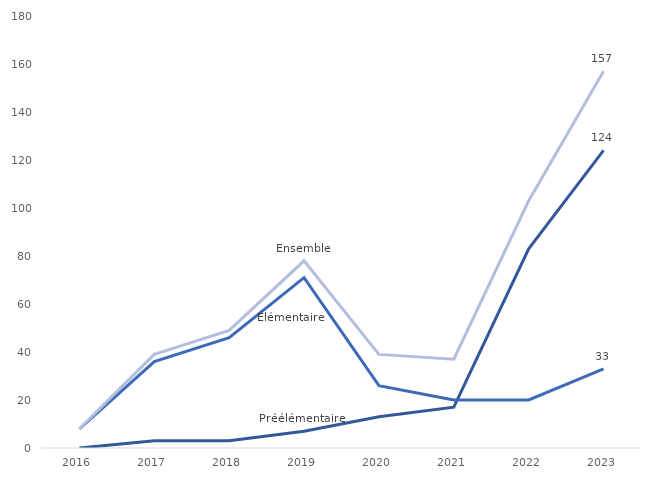
| Category | Préélémentaire  | Élémentaire  | Ensemble |
|---|---|---|---|
| 2016.0 | 0 | 8 | 8 |
| 2017.0 | 3 | 36 | 39 |
| 2018.0 | 3 | 46 | 49 |
| 2019.0 | 7 | 71 | 78 |
| 2020.0 | 13 | 26 | 39 |
| 2021.0 | 17 | 20 | 37 |
| 2022.0 | 83 | 20 | 103 |
| 2023.0 | 124 | 33 | 157 |